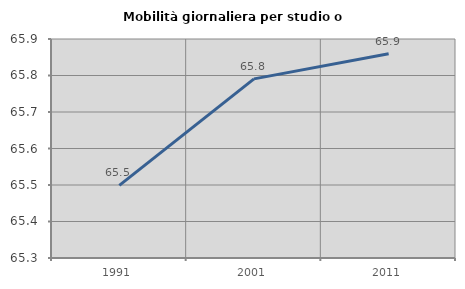
| Category | Mobilità giornaliera per studio o lavoro |
|---|---|
| 1991.0 | 65.499 |
| 2001.0 | 65.791 |
| 2011.0 | 65.859 |